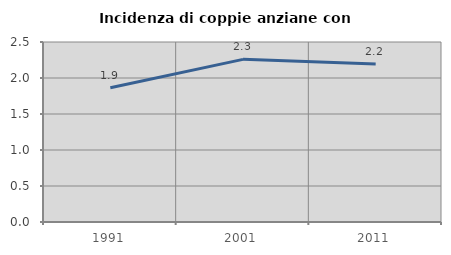
| Category | Incidenza di coppie anziane con figli |
|---|---|
| 1991.0 | 1.863 |
| 2001.0 | 2.259 |
| 2011.0 | 2.194 |